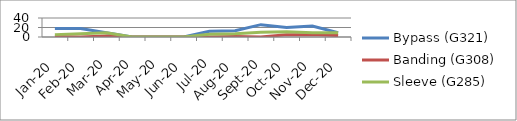
| Category | Bypass (G321) | Banding (G308) | Sleeve (G285) |
|---|---|---|---|
| 2020-01-01 | 18 | 1 | 5 |
| 2020-02-01 | 18 | 0 | 7 |
| 2020-03-01 | 9 | 2 | 9 |
| 2020-04-01 | 0 | 0 | 0 |
| 2020-05-01 | 0 | 0 | 0 |
| 2020-06-01 | 0 | 0 | 0 |
| 2020-07-01 | 12 | 0 | 6 |
| 2020-08-01 | 13 | 1 | 7 |
| 2020-09-01 | 26 | 0 | 10 |
| 2020-10-01 | 20 | 5 | 11 |
| 2020-11-01 | 23 | 5 | 9 |
| 2020-12-01 | 9 | 3 | 9 |